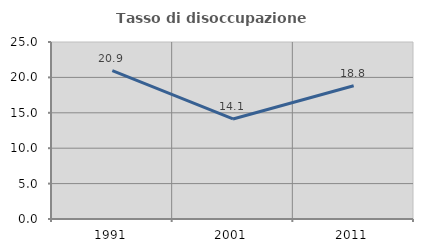
| Category | Tasso di disoccupazione giovanile  |
|---|---|
| 1991.0 | 20.942 |
| 2001.0 | 14.134 |
| 2011.0 | 18.812 |